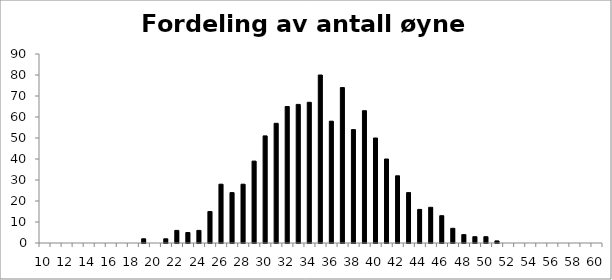
| Category | Fordeling av antall øyne totalt |
|---|---|
| 10.0 | 0 |
| 11.0 | 0 |
| 12.0 | 0 |
| 13.0 | 0 |
| 14.0 | 0 |
| 15.0 | 0 |
| 16.0 | 0 |
| 17.0 | 0 |
| 18.0 | 0 |
| 19.0 | 2 |
| 20.0 | 0 |
| 21.0 | 2 |
| 22.0 | 6 |
| 23.0 | 5 |
| 24.0 | 6 |
| 25.0 | 15 |
| 26.0 | 28 |
| 27.0 | 24 |
| 28.0 | 28 |
| 29.0 | 39 |
| 30.0 | 51 |
| 31.0 | 57 |
| 32.0 | 65 |
| 33.0 | 66 |
| 34.0 | 67 |
| 35.0 | 80 |
| 36.0 | 58 |
| 37.0 | 74 |
| 38.0 | 54 |
| 39.0 | 63 |
| 40.0 | 50 |
| 41.0 | 40 |
| 42.0 | 32 |
| 43.0 | 24 |
| 44.0 | 16 |
| 45.0 | 17 |
| 46.0 | 13 |
| 47.0 | 7 |
| 48.0 | 4 |
| 49.0 | 3 |
| 50.0 | 3 |
| 51.0 | 1 |
| 52.0 | 0 |
| 53.0 | 0 |
| 54.0 | 0 |
| 55.0 | 0 |
| 56.0 | 0 |
| 57.0 | 0 |
| 58.0 | 0 |
| 59.0 | 0 |
| 60.0 | 0 |